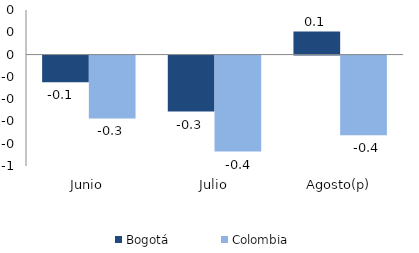
| Category | Bogotá | Colombia |
|---|---|---|
| Junio | -0.12 | -0.282 |
| Julio | -0.251 | -0.431 |
| Agosto(p) | 0.104 | -0.358 |